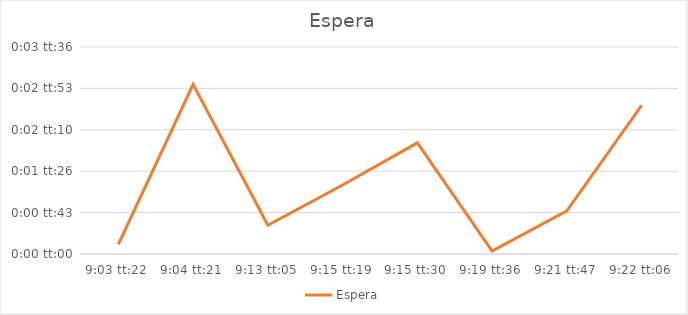
| Category | Espera |
|---|---|
| 0.37733796296296296 | 0 |
| 0.3780208333333333 | 0.002 |
| 0.3840856481481481 | 0 |
| 0.3856365740740741 | 0.001 |
| 0.38576388888888885 | 0.001 |
| 0.3886111111111111 | 0 |
| 0.39012731481481483 | 0.001 |
| 0.39034722222222223 | 0.002 |